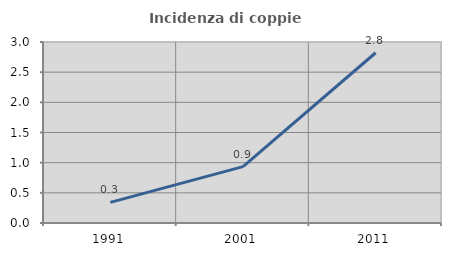
| Category | Incidenza di coppie miste |
|---|---|
| 1991.0 | 0.341 |
| 2001.0 | 0.935 |
| 2011.0 | 2.822 |